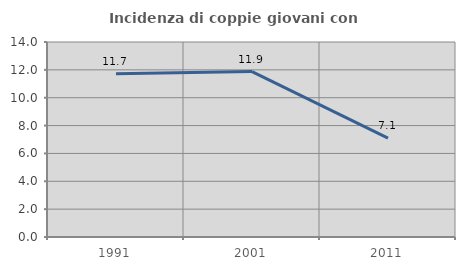
| Category | Incidenza di coppie giovani con figli |
|---|---|
| 1991.0 | 11.719 |
| 2001.0 | 11.877 |
| 2011.0 | 7.092 |